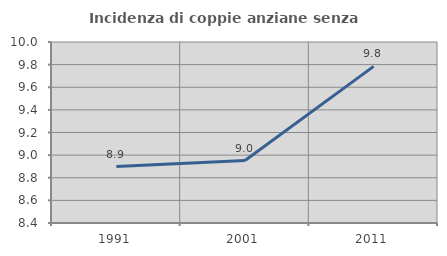
| Category | Incidenza di coppie anziane senza figli  |
|---|---|
| 1991.0 | 8.899 |
| 2001.0 | 8.952 |
| 2011.0 | 9.785 |